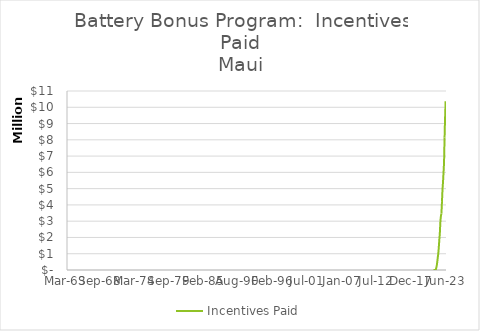
| Category | Incentives Paid |
|---|---|
| 44378.0 | 0 |
| 44409.0 | 0 |
| 44440.0 | 0 |
| 44470.0 | 0 |
| 44501.0 | 0 |
| 44531.0 | 118150 |
| 44562.0 | 261800 |
| 44593.0 | 502554 |
| 44621.0 | 756815 |
| 44652.0 | 1014263 |
| 44682.0 | 1395029 |
| 44713.0 | 1864535 |
| 44743.0 | 2277550 |
| 44774.0 | 2960814 |
| 44805.0 | 3304214 |
| 44835.0 | 3468009 |
| 44866.0 | 4185426 |
| 44896.0 | 4925374 |
| 44927.0 | 5413693 |
| 44958.0 | 6017856 |
| 44986.0 | 6572178 |
| 45017.0 | 8136532 |
| 45047.0 | 9348071 |
| 45078.0 | 10367501 |